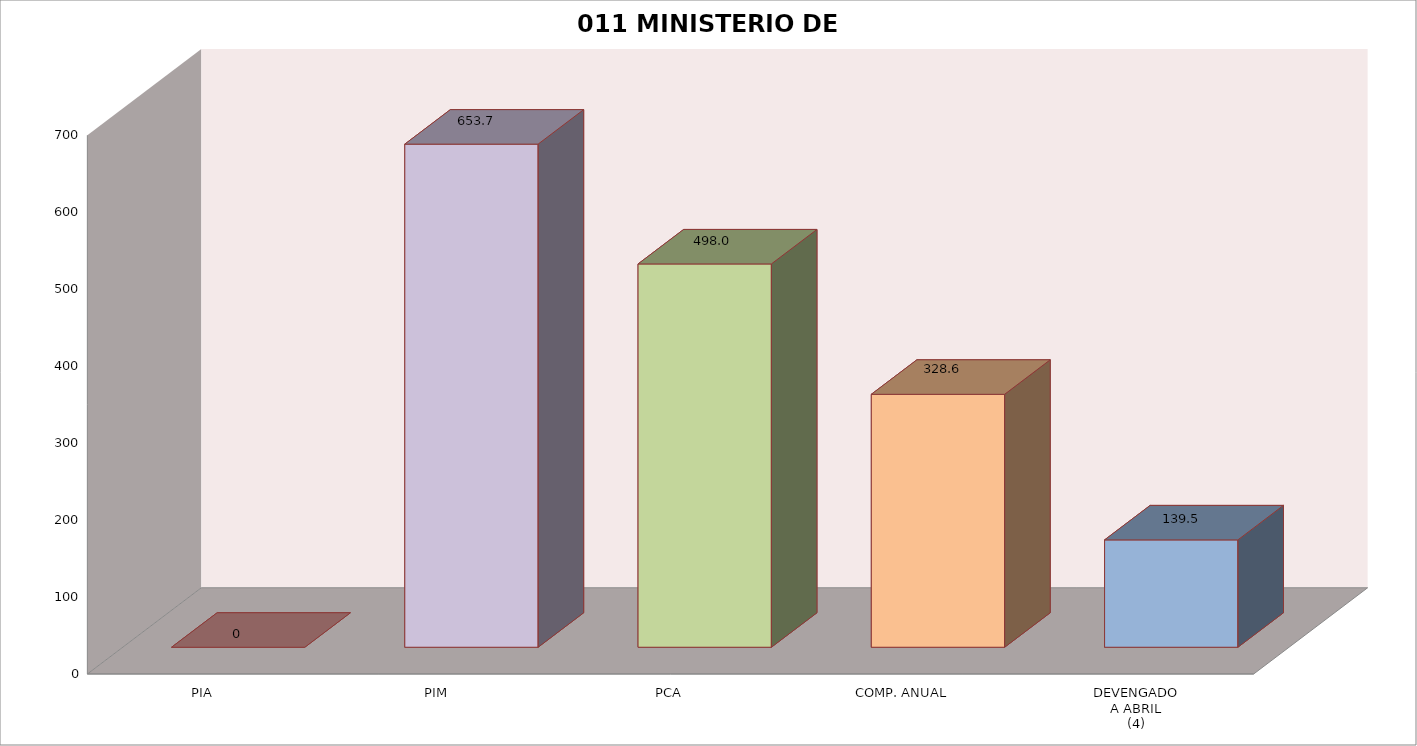
| Category | 011 MINISTERIO DE SALUD |
|---|---|
| PIA | 0 |
| PIM | 653.699 |
| PCA | 498.017 |
| COMP. ANUAL | 328.65 |
| DEVENGADO
A ABRIL
(4) | 139.488 |